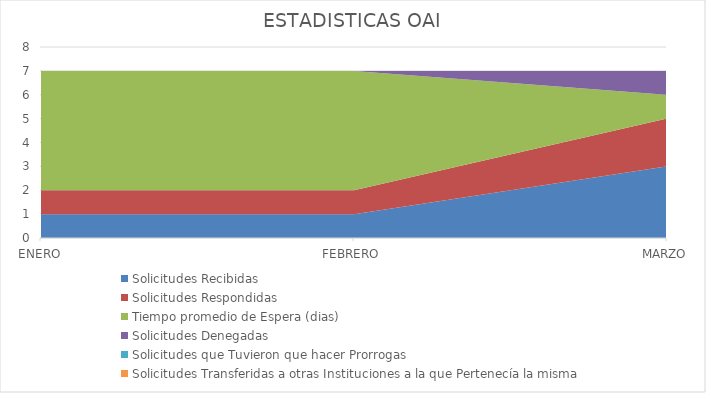
| Category | Solicitudes Recibidas | Solicitudes Respondidas | Tiempo promedio de Espera (dias) | Solicitudes Denegadas | Solicitudes que Tuvieron que hacer Prorrogas  | Solicitudes Transferidas a otras Instituciones a la que Pertenecía la misma |
|---|---|---|---|---|---|---|
| ENERO | 1 | 1 | 5 | 0 | 0 | 0 |
| FEBRERO | 1 | 1 | 5 | 0 | 0 | 0 |
| MARZO | 3 | 2 | 1 | 1 | 0 | 0 |